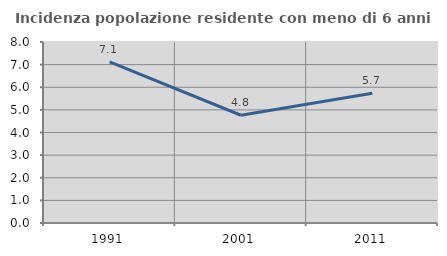
| Category | Incidenza popolazione residente con meno di 6 anni |
|---|---|
| 1991.0 | 7.117 |
| 2001.0 | 4.762 |
| 2011.0 | 5.735 |